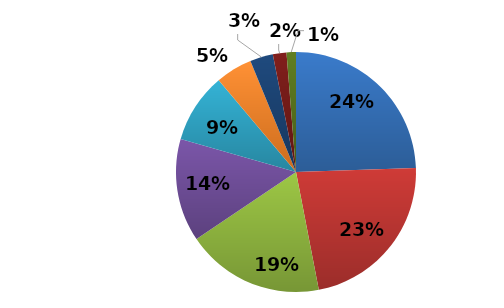
| Category | Series 0 |
|---|---|
| KOJ | 213 |
| PRV | 196 |
| ONV | 162 |
| OLO | 121 |
| HRA | 82 |
| SLH | 43 |
| LIT | 27 |
| LSB | 16 |
| FRM | 11 |